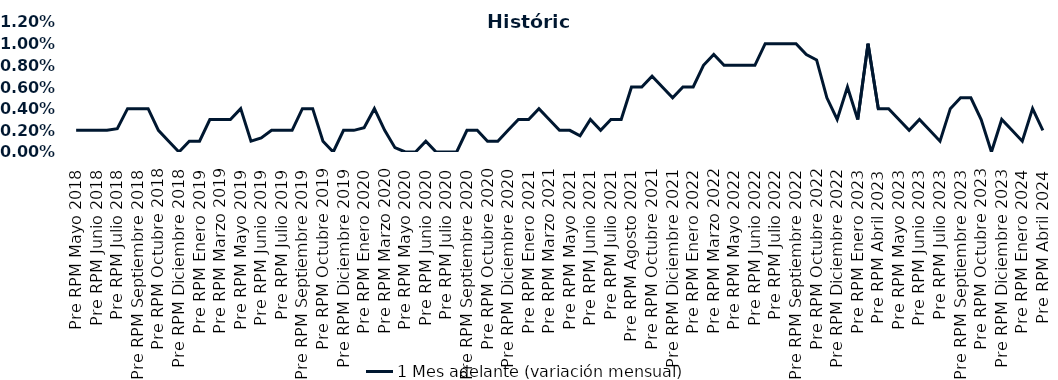
| Category | 1 Mes adelante (variación mensual) |
|---|---|
| Pre RPM Mayo 2018 | 0.002 |
| Post RPM Mayo 2018 | 0.002 |
| Pre RPM Junio 2018 | 0.002 |
| Post RPM Junio 2018 | 0.002 |
| Pre RPM Julio 2018 | 0.002 |
| Post RPM Julio 2018 | 0.004 |
| Pre RPM Septiembre 2018 | 0.004 |
| Post RPM Septiembre 2018 | 0.004 |
| Pre RPM Octubre 2018 | 0.002 |
| Post RPM Octubre 2018 | 0.001 |
| Pre RPM Diciembre 2018 | 0 |
| Post RPM Diciembre 2018 | 0.001 |
| Pre RPM Enero 2019 | 0.001 |
| Post RPM Enero 2019 | 0.003 |
| Pre RPM Marzo 2019 | 0.003 |
| Post RPM Marzo 2019 | 0.003 |
| Pre RPM Mayo 2019 | 0.004 |
| Post RPM Mayo 2019 | 0.001 |
| Pre RPM Junio 2019 | 0.001 |
| Post RPM Junio 2019 | 0.002 |
| Pre RPM Julio 2019 | 0.002 |
| Post RPM Julio 2019 | 0.002 |
| Pre RPM Septiembre 2019 | 0.004 |
| Post RPM Septiembre 2019 | 0.004 |
| Pre RPM Octubre 2019 | 0.001 |
| Post RPM Octubre 2019 | 0 |
| Pre RPM Diciembre 2019 | 0.002 |
| Post RPM Diciembre 2019 | 0.002 |
| Pre RPM Enero 2020 | 0.002 |
| Post RPM Enero 2020 | 0.004 |
| Pre RPM Marzo 2020 | 0.002 |
| Post RPM Marzo 2020 | 0 |
| Pre RPM Mayo 2020 | 0 |
| Post RPM Mayo 2020 | 0 |
| Pre RPM Junio 2020 | 0.001 |
| Post RPM Junio 2020 | 0 |
| Pre RPM Julio 2020 | 0 |
| Post RPM Julio 2020 | 0 |
| Pre RPM Septiembre 2020 | 0.002 |
| Post RPM Septiembre 2020 | 0.002 |
| Pre RPM Octubre 2020 | 0.001 |
| Post RPM Octubre 2020 | 0.001 |
| Pre RPM Diciembre 2020 | 0.002 |
| Post RPM Diciembre 2020 | 0.003 |
| Pre RPM Enero 2021 | 0.003 |
| Post RPM Enero 2021 | 0.004 |
| Pre RPM Marzo 2021 | 0.003 |
| Post RPM Marzo 2021 | 0.002 |
| Pre RPM Mayo 2021 | 0.002 |
| Post RPM Mayo 2021 | 0.002 |
| Pre RPM Junio 2021 | 0.003 |
| Post RPM Junio 2021 | 0.002 |
| Pre RPM Julio 2021 | 0.003 |
| Post RPM Julio 2021 | 0.003 |
| Pre RPM Agosto 2021 | 0.006 |
| Post RPM Agosto 2021 | 0.006 |
| Pre RPM Octubre 2021 | 0.007 |
| Post RPM Octubre 2021 | 0.006 |
| Pre RPM Diciembre 2021 | 0.005 |
| Post RPM Diciembre 2021 | 0.006 |
| Pre RPM Enero 2022 | 0.006 |
| Post RPM Enero 2022 | 0.008 |
| Pre RPM Marzo 2022 | 0.009 |
| Post RPM Marzo 2022 | 0.008 |
| Pre RPM Mayo 2022 | 0.008 |
| Post RPM Mayo 2022 | 0.008 |
| Pre RPM Junio 2022 | 0.008 |
| Post RPM Junio 2022 | 0.01 |
| Pre RPM Julio 2022 | 0.01 |
| Post RPM Julio 2022 | 0.01 |
| Pre RPM Septiembre 2022 | 0.01 |
| Post RPM Septiembre 2022 | 0.009 |
| Pre RPM Octubre 2022 | 0.008 |
| Post RPM Octubre 2022 | 0.005 |
| Pre RPM Diciembre 2022 | 0.003 |
| Post RPM Diciembre 2022 | 0.006 |
| Pre RPM Enero 2023 | 0.003 |
| Post RPM Enero 2023 | 0.01 |
| Pre RPM Abril 2023 | 0.004 |
| Post RPM Abril 2023 | 0.004 |
| Pre RPM Mayo 2023 | 0.003 |
| Post RPM Mayo 2023 | 0.002 |
| Pre RPM Junio 2023 | 0.003 |
| Post RPM Junio 2023 | 0.002 |
| Pre RPM Julio 2023 | 0.001 |
| Post RPM Julio 2023 | 0.004 |
| Pre RPM Septiembre 2023 | 0.005 |
| Post RPM Septiembre 2023 | 0.005 |
| Pre RPM Octubre 2023 | 0.003 |
| Post RPM Octubre 2023 | 0 |
| Pre RPM Diciembre 2023 | 0.003 |
| Post RPM Diciembre 2023 | 0.002 |
| Pre RPM Enero 2024 | 0.001 |
| Post RPM Enero 2024 | 0.004 |
| Pre RPM Abril 2024 | 0.002 |